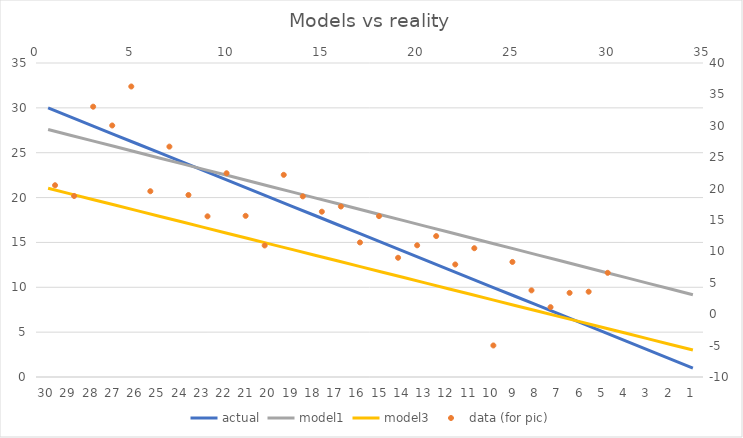
| Category | actual | model1 | model3 |
|---|---|---|---|
| 30.0 | 30 | 27.59 | 21.032 |
| 29.0 | 29 | 26.955 | 20.41 |
| 28.0 | 28 | 26.32 | 19.788 |
| 27.0 | 27 | 25.684 | 19.167 |
| 26.0 | 26 | 25.049 | 18.545 |
| 25.0 | 25 | 24.414 | 17.923 |
| 24.0 | 24 | 23.779 | 17.302 |
| 23.0 | 23 | 23.143 | 16.68 |
| 22.0 | 22 | 22.508 | 16.059 |
| 21.0 | 21 | 21.873 | 15.437 |
| 20.0 | 20 | 21.238 | 14.815 |
| 19.0 | 19 | 20.602 | 14.194 |
| 18.0 | 18 | 19.967 | 13.572 |
| 17.0 | 17 | 19.332 | 12.951 |
| 16.0 | 16 | 18.697 | 12.329 |
| 15.0 | 15 | 18.061 | 11.707 |
| 14.0 | 14 | 17.426 | 11.086 |
| 13.0 | 13 | 16.791 | 10.464 |
| 12.0 | 12 | 16.155 | 9.842 |
| 11.0 | 11 | 15.52 | 9.221 |
| 10.0 | 10 | 14.885 | 8.599 |
| 9.0 | 9 | 14.25 | 7.978 |
| 8.0 | 8 | 13.614 | 7.356 |
| 7.0 | 7 | 12.979 | 6.734 |
| 6.0 | 6 | 12.344 | 6.113 |
| 5.0 | 5 | 11.709 | 5.491 |
| 4.0 | 4 | 11.073 | 4.869 |
| 3.0 | 3 | 10.438 | 4.248 |
| 2.0 | 2 | 9.803 | 3.626 |
| 1.0 | 1 | 9.168 | 3.005 |